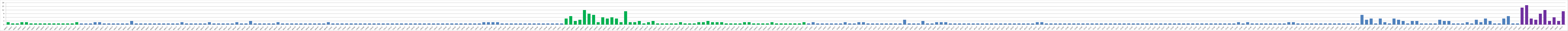
| Category | Series 0 |
|---|---|
| AW01 | 2 |
| AW02 | 1 |
| AW03 | 1 |
| AW04 | 2 |
| AW05 | 2 |
| AW06 | 1 |
| AW07 | 1 |
| AW08 | 1 |
| AW09 | 1 |
| AW10 | 1 |
| AW11 | 1 |
| AW12 | 1 |
| AW13 | 1 |
| AW14 | 1 |
| AW15 | 1 |
| AW16 | 2 |
| AW17 | 1 |
| AW18 | 1 |
| AW19 | 1 |
| AW20 | 2 |
| AW21 | 2 |
| AW22 | 1 |
| AW23 | 1 |
| AW24 | 1 |
| AW25 | 1 |
| BW01 | 1 |
| BW02 | 1 |
| BW03 | 3 |
| BWO4 | 1 |
| BW05 | 1 |
| BW06 | 1 |
| BW07 | 1 |
| BW08 | 1 |
| BW09 | 1 |
| BW10 | 1 |
| BW11 | 1 |
| BW12 | 1 |
| BW13 | 1 |
| BW14 | 2 |
| BW15 | 1 |
| BW16 | 1 |
| BW17 | 1 |
| BW18 | 1 |
| BW19 | 1 |
| BW20 | 2 |
| BW21 | 1 |
| BW22 | 1 |
| BW23 | 1 |
| BW24 | 1 |
| BW25 | 1 |
| BW26 | 2 |
| BW27 | 1 |
| BW28 | 1 |
| BW29 | 3 |
| BW30 | 1 |
| BW31 | 1 |
| BW32 | 1 |
| BW33 | 1 |
| BW34 | 1 |
| BW35 | 2 |
| BW36 | 1 |
| BW37 | 1 |
| BW38 | 1 |
| BW39 | 1 |
| BW40 | 1 |
| BW41 | 1 |
| BW42 | 1 |
| BW43 | 1 |
| BW44 | 1 |
| BW45 | 1 |
| BW46 | 2 |
| CW01 | 1 |
| CW02 | 1 |
| CW03 | 1 |
| CW04 | 1 |
| CW05 | 1 |
| CW06 | 1 |
| CW07 | 1 |
| CW08 | 1 |
| CW09 | 1 |
| CW10 | 1 |
| CW11 | 1 |
| CW12 | 1 |
| CW13 | 1 |
| CW14 | 1 |
| CW15 | 1 |
| CW16 | 1 |
| CW17 | 1 |
| CW18 | 1 |
| CW19 | 1 |
| CW20 | 1 |
| CW21 | 1 |
| CW22 | 1 |
| CW23 | 1 |
| CW24 | 1 |
| CW25 | 1 |
| CW26 | 1 |
| CW27 | 1 |
| CW28 | 1 |
| CW29 | 1 |
| CW30 | 1 |
| CW31 | 1 |
| CW32 | 1 |
| CW33 | 1 |
| CW34 | 2 |
| CW35 | 2 |
| CW36 | 2 |
| CW37 | 2 |
| CW38 | 1 |
| CW39 | 1 |
| CW40 | 1 |
| CW41 | 1 |
| CW42 | 1 |
| CW43 | 1 |
| CW44 | 1 |
| CW45 | 1 |
| CW46 | 1 |
| CW47 | 1 |
| CW48 | 1 |
| CW49 | 1 |
| CW50 | 1 |
| CW51 | 1 |
| DW01 | 5 |
| DW02 | 7 |
| DW03 | 3 |
| DW04 | 4 |
| DW05 | 12 |
| DW06 | 9 |
| DW07 | 8 |
| DW08 | 2 |
| DW09 | 6 |
| DW10 | 5 |
| DW11 | 6 |
| DW12 | 5 |
| DW13 | 2 |
| DW14 | 11 |
| DW15 | 2 |
| DW16 | 2 |
| DW17 | 3 |
| DW18 | 1 |
| DW19 | 2 |
| DW20 | 3 |
| DW21 | 1 |
| DW22 | 1 |
| DW23 | 1 |
| DW24 | 1 |
| DW25 | 1 |
| DW26 | 2 |
| DW27 | 1 |
| DW28 | 1 |
| DW29 | 1 |
| DW30 | 2 |
| DW31 | 2 |
| DW32 | 3 |
| DW33 | 2 |
| DW34 | 2 |
| DW35 | 2 |
| DW36 | 1 |
| DW37 | 1 |
| DW38 | 1 |
| DW39 | 1 |
| DW40 | 2 |
| DW40 | 2 |
| DW41 | 1 |
| DW42 | 1 |
| DW43 | 1 |
| DW44 | 1 |
| DW45 | 2 |
| DW46 | 1 |
| DW47 | 1 |
| DW48 | 1 |
| DW49 | 1 |
| DW50 | 1 |
| DW51 | 1 |
| DW52 | 2 |
| AU01 | 1 |
| AU02 | 2 |
| AU03 | 1 |
| AU04 | 1 |
| AU05 | 1 |
| AU06 | 1 |
| AU07 | 1 |
| AU08 | 1 |
| AU09 | 2 |
| AU10 | 1 |
| AU11 | 1 |
| AU12 | 2 |
| AU13 | 2 |
| AU14 | 1 |
| AU15 | 1 |
| AU16 | 1 |
| AU17 | 1 |
| AU18 | 1 |
| AU19 | 1 |
| AU20 | 1 |
| BU01 | 1 |
| BU02 | 4 |
| BU03 | 1 |
| BU04 | 1 |
| BU05 | 1 |
| BU06 | 3 |
| BU07 | 1 |
| BU08 | 1 |
| BU09 | 2 |
| BU10 | 2 |
| BU11 | 2 |
| BU12 | 1 |
| BU13 | 1 |
| BU14 | 1 |
| BU15 | 1 |
| BU16 | 1 |
| BU17 | 1 |
| BU18 | 1 |
| BU19 | 1 |
| BU20 | 1 |
| BU21 | 1 |
| BU22 | 1 |
| BU23 | 1 |
| BU24 | 1 |
| BU25 | 1 |
| BU26 | 1 |
| BU27 | 1 |
| BU28 | 1 |
| BU29 | 1 |
| BU30 | 1 |
| BU32 | 2 |
| BU33 | 2 |
| CU01 | 1 |
| CU02 | 1 |
| CU03 | 1 |
| CU04 | 1 |
| CU05 | 1 |
| CU06 | 1 |
| CU07 | 1 |
| CU08 | 1 |
| CU09 | 1 |
| CU10 | 1 |
| CU11 | 1 |
| CU12 | 1 |
| CU13 | 1 |
| CU14 | 1 |
| CU15 | 1 |
| CU16 | 1 |
| CU17 | 1 |
| CU18 | 1 |
| CU19 | 1 |
| CU20 | 1 |
| CU21 | 1 |
| CU22 | 1 |
| CU23 | 1 |
| CU24 | 1 |
| CU25 | 1 |
| CU26 | 1 |
| CU27 | 1 |
| CU28 | 1 |
| CU29 | 1 |
| CU30 | 1 |
| CU31 | 1 |
| CU32 | 1 |
| CU33 | 1 |
| CU34 | 1 |
| CU35 | 1 |
| CU36 | 1 |
| CU37 | 1 |
| CU38 | 1 |
| CU39 | 1 |
| CU40 | 1 |
| CU41 | 1 |
| CU42 | 1 |
| CU43 | 2 |
| CU44 | 1 |
| CU45 | 2 |
| CU46 | 1 |
| CU47 | 1 |
| CU48 | 1 |
| CU49 | 1 |
| CU50 | 1 |
| CU51 | 1 |
| CU52 | 1 |
| CU53 | 1 |
| CU54 | 2 |
| CU55 | 2 |
| CU56 | 1 |
| CU57 | 1 |
| CU58 | 1 |
| CU59 | 1 |
| CU60 | 1 |
| CU61 | 1 |
| CU62 | 1 |
| CU63 | 1 |
| CU64 | 1 |
| CU65 | 1 |
| CU66 | 1 |
| CU67 | 1 |
| CU68 | 1 |
| CU69 | 1 |
| DU01 | 8 |
| DU02 | 4 |
| DU03 | 5 |
| DU04 | 1 |
| DU05 | 5 |
| DU06 | 2 |
| DU07 | 1 |
| DU08 | 5 |
| DU09 | 4 |
| DU10 | 3 |
| DU11 | 1 |
| DU12 | 3 |
| DU13 | 3 |
| DU14 | 1 |
| DU15 | 1 |
| DU16 | 1 |
| DU17 | 1 |
| DU18 | 4 |
| DU19 | 3 |
| DU20 | 3 |
| DU21 | 1 |
| DU22 | 1 |
| DU23 | 1 |
| DU24 | 2 |
| DU25 | 1 |
| DU26 | 4 |
| DU27 | 2 |
| DU28 | 5 |
| DU29 | 3 |
| DU30 | 1 |
| DU31 | 1 |
| DU32 | 5 |
| DU33 | 7 |
| DU34 | 1 |
| DU35 | 1 |
| DK01 | 14 |
| DK02 | 16 |
| DK03 | 5 |
| DK04 | 4 |
| DK05 | 9 |
| DK06 | 12 |
| DK07 | 3 |
| DK08 | 6 |
| DK09 | 3 |
| DK10 | 11 |